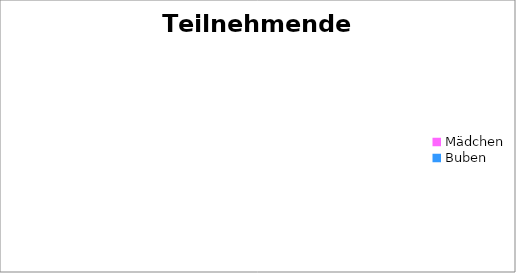
| Category | Series 0 |
|---|---|
| Mädchen | 0 |
| Buben | 0 |